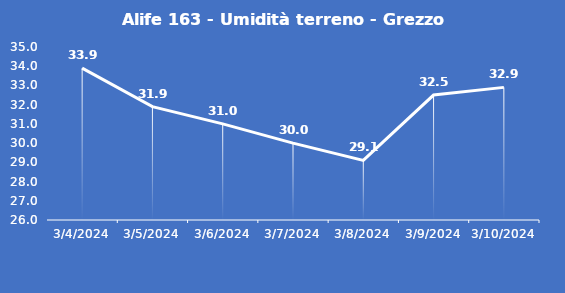
| Category | Alife 163 - Umidità terreno - Grezzo (%VWC) |
|---|---|
| 3/4/24 | 33.9 |
| 3/5/24 | 31.9 |
| 3/6/24 | 31 |
| 3/7/24 | 30 |
| 3/8/24 | 29.1 |
| 3/9/24 | 32.5 |
| 3/10/24 | 32.9 |